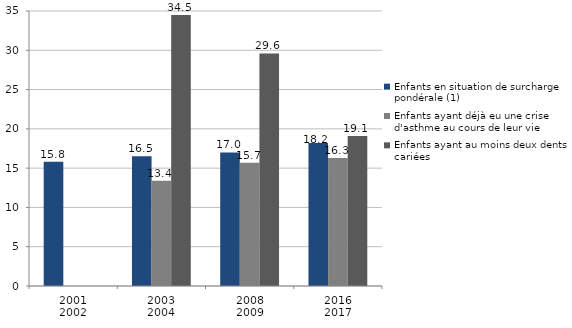
| Category | Enfants en situation de surcharge pondérale (1) | Enfants ayant déjà eu une crise d'asthme au cours de leur vie | Enfants ayant au moins deux dents cariées |
|---|---|---|---|
| 2001
2002 | 15.8 | 0 | 0 |
| 2003
2004 | 16.5 | 13.4 | 34.5 |
| 2008
2009 | 17 | 15.7 | 29.6 |
| 2016
2017 | 18.2 | 16.3 | 19.1 |